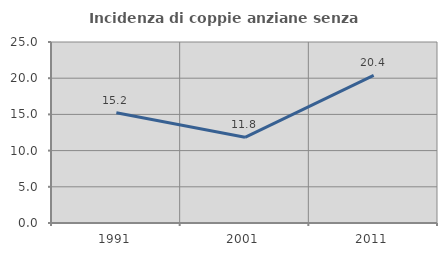
| Category | Incidenza di coppie anziane senza figli  |
|---|---|
| 1991.0 | 15.228 |
| 2001.0 | 11.834 |
| 2011.0 | 20.395 |